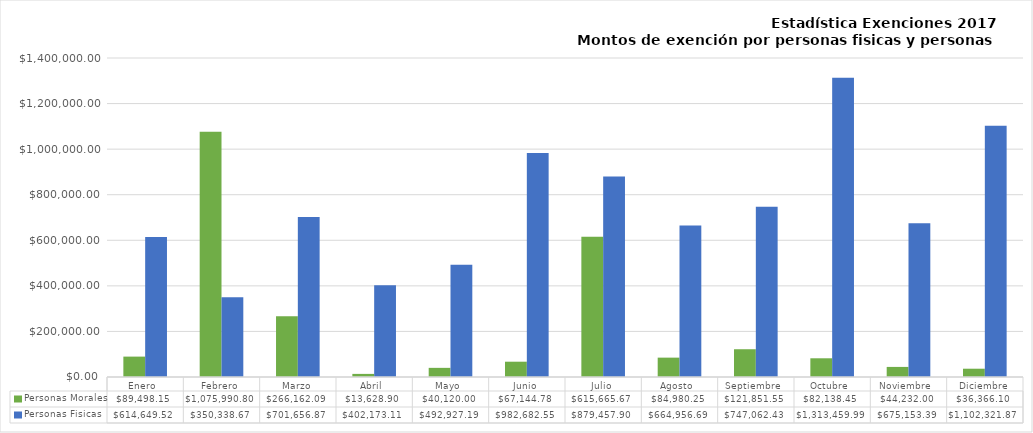
| Category | Personas Morales | Personas Fisicas |
|---|---|---|
| Enero  | 89498.15 | 614649.52 |
| Febrero | 1075990.8 | 350338.67 |
| Marzo | 266162.09 | 701656.87 |
| Abril  | 13628.9 | 402173.11 |
| Mayo  | 40120 | 492927.19 |
| Junio | 67144.78 | 982682.55 |
| Julio | 615665.67 | 879457.9 |
| Agosto  | 84980.25 | 664956.69 |
| Septiembre  | 121851.55 | 747062.43 |
| Octubre  | 82138.45 | 1313459.99 |
| Noviembre  | 44232 | 675153.39 |
| Diciembre | 36366.1 | 1102321.87 |